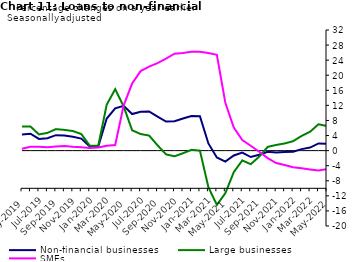
| Category | zero | Non-financial businesses | Large businesses | SMEs |
|---|---|---|---|---|
| May-2019 | 0 | 4.3 | 6.4 | 0.5 |
| Jun-2019 | 0 | 4.5 | 6.4 | 1 |
| Jul-2019 | 0 | 3.1 | 4.3 | 1 |
| Aug-2019 | 0 | 3.3 | 4.7 | 0.9 |
| Sep-2019 | 0 | 4.1 | 5.7 | 1.1 |
| Oct-2019 | 0 | 4 | 5.5 | 1.2 |
| Nov-2019 | 0 | 3.7 | 5.2 | 1 |
| Dec-2019 | 0 | 3.2 | 4.4 | 0.9 |
| Jan-2020 | 0 | 1.1 | 1.3 | 0.7 |
| Feb-2020 | 0 | 1.1 | 1.3 | 0.8 |
| Mar-2020 | 0 | 8.5 | 12.2 | 1.3 |
| Apr-2020 | 0 | 11.2 | 16.3 | 1.5 |
| May-2020 | 0 | 11.9 | 11.7 | 12 |
| Jun-2020 | 0 | 9.7 | 5.4 | 17.8 |
| Jul-2020 | 0 | 10.3 | 4.4 | 21.1 |
| Aug-2020 | 0 | 10.4 | 4 | 22.3 |
| Sep-2020 | 0 | 9 | 1.4 | 23.2 |
| Oct-2020 | 0 | 7.7 | -1 | 24.4 |
| Nov-2020 | 0 | 7.8 | -1.5 | 25.7 |
| Dec-2020 | 0 | 8.5 | -0.7 | 25.9 |
| Jan-2021 | 0 | 9.2 | 0.2 | 26.2 |
| Feb-2021 | 0 | 9.1 | 0 | 26.2 |
| Mar-2021 | 0 | 1.9 | -9.7 | 25.9 |
| Apr-2021 | 0 | -1.8 | -14.4 | 25.4 |
| May-2021 | 0 | -2.9 | -11.3 | 12.7 |
| Jun-2021 | 0 | -1.3 | -5.7 | 6.1 |
| Jul-2021 | 0 | -0.5 | -2.6 | 2.8 |
| Aug-2021 | 0 | -1.7 | -3.6 | 1.3 |
| Sep-2021 | 0 | -1.1 | -1.6 | -0.3 |
| Oct-2021 | 0 | -0.3 | 1 | -2 |
| Nov-2021 | 0 | -0.5 | 1.5 | -3.3 |
| Dec-2021 | 0 | -0.4 | 1.9 | -3.8 |
| Jan-2022 | 0 | -0.3 | 2.5 | -4.4 |
| Feb-2022 | 0 | 0.4 | 3.9 | -4.7 |
| Mar-2022 | 0 | 0.8 | 5 | -5 |
| Apr-2022 | 0 | 1.9 | 7 | -5.3 |
| May-2022 | 0 | 1.8 | 6.5 | -4.9 |